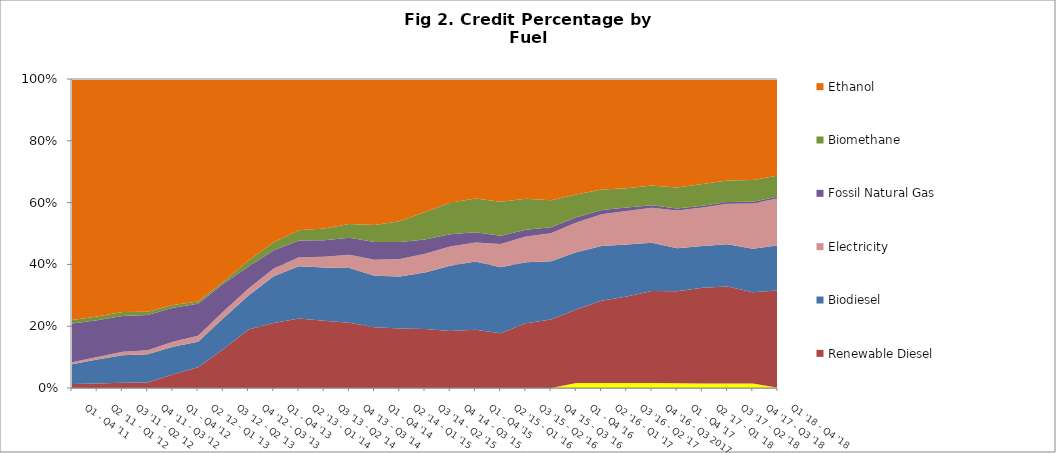
| Category | Other (Hydrogen, Renewable Naphtha, Innovative Crude & Low Complexity / Low Energy Use Refining, etc.) | Renewable Diesel | Biodiesel | Electricity | Fossil Natural Gas | Biomethane | Ethanol |
|---|---|---|---|---|---|---|---|
| Q1 - Q4 '11 | 0 | 4255 | 21066.75 | 1935.75 | 41097.5 | 3678.75 | 255888.25 |
| Q2 '11 - Q1 '12 | 0 | 5162.75 | 26837.25 | 2950.75 | 41170.5 | 4217.5 | 266727.25 |
| Q3 '11 - Q2 '12 | 0 | 6021.75 | 31928.25 | 4017.5 | 41417.75 | 4505.5 | 269743.5 |
| Q4 '11 - Q3 '12 | 0 | 6915.75 | 34835.25 | 5227.25 | 43542.5 | 4159.75 | 288811 |
| Q1 - Q4 '12 | 0 | 18164.75 | 37336.75 | 6746 | 45792.5 | 3711.25 | 304773.5 |
| Q2 '12 - Q1 '13 | 0 | 32600.75 | 40337.75 | 9379 | 50547.5 | 3679.5 | 351042.25 |
| Q3 '12 - Q2 '13 | 0 | 75473 | 60626 | 12868 | 54271 | 3919.25 | 394796.75 |
| Q4 '12 - Q3 '13 | 0 | 145738 | 84731.75 | 17304.25 | 54494 | 15303.75 | 451907.5 |
| Q1 - Q4 '13 | 0 | 197482.25 | 141667.5 | 23488.25 | 55487 | 24517.25 | 495969.5 |
| Q2 '13 - Q1 '14 | 0 | 229472.75 | 172125.5 | 30163.75 | 55101.5 | 33883.25 | 499193 |
| Q3 '13 - Q2 '14 | 0 | 237650.5 | 187184.5 | 38057.75 | 58197.25 | 42046.25 | 527117.75 |
| Q4 '13 - Q3 '14 | 0 | 230531.5 | 193299.25 | 46639.5 | 60710.25 | 47887.5 | 512500.5 |
| Q1 - Q4 '14 | 0 | 211244.75 | 179500 | 55332.5 | 61841.25 | 59811.5 | 507720.75 |
| Q2 '14 - Q1 '15 | 0 | 214231 | 186099.25 | 63321.25 | 61021 | 74716.5 | 511213.5 |
| Q3 '14 - Q2 '15 | 0 | 221521.75 | 212265.5 | 70066.25 | 54408.25 | 102903.75 | 499516 |
| Q4 '14 - Q3 '15 | 12.5 | 231039 | 264657.25 | 77983.75 | 49846.25 | 127871.25 | 502037.5 |
| Q1 - Q4 '15 | 18.5 | 259542.75 | 303477.5 | 84435 | 45377.25 | 150052.5 | 531188.5 |
| Q2 '15 - Q1 '16 | 26.75 | 277096.75 | 335225.5 | 117624 | 41742.25 | 172371 | 621973.75 |
| Q3 '15 - Q2 '16 | 33.75 | 384694.75 | 361311.75 | 152143.25 | 41127 | 183920 | 710130.25 |
| Q4 '15 - Q3 '16 | 21.5 | 454443.5 | 387917 | 185794.25 | 40467.75 | 179576.75 | 805438 |
| Q1 - Q4 '16 | 37958 | 560304.25 | 434195.75 | 226393.5 | 39804.75 | 173305 | 879776.75 |
| Q2 '16 - Q1 '17 | 38363.25 | 644325.25 | 430204 | 247688.75 | 33842 | 159815.25 | 866449 |
| Q3 '16 - Q2 '17 | 40188.25 | 685591.75 | 412601.75 | 267404 | 27047.25 | 153969 | 866394.5 |
| Q4 '16 - Q3 2017 | 40079.5 | 752235 | 393268 | 286840.25 | 20562.25 | 161509.25 | 869357.25 |
| Q1 - Q4 '17 | 37325 | 741682.5 | 345519.5 | 303525 | 14683.75 | 170107.5 | 872056 |
| Q2 '17 - Q1 '18 | 37867.5 | 794697.25 | 345457.75 | 319346.25 | 14499.25 | 180824.5 | 870380.25 |
| Q3 '17 - Q2 '18 | 38028.5 | 811822.25 | 354342 | 339261.75 | 15154.75 | 180100.25 | 850128.25 |
| Q4 '17 - Q3 '18 | 38043.75 | 771975.75 | 366447 | 382073.25 | 15365.75 | 183308.5 | 854713.25 |
| Q1 '18 - Q4 '18 | 2621 | 871377.5 | 401785 | 421714.25 | 14692.5 | 187822 | 864746 |